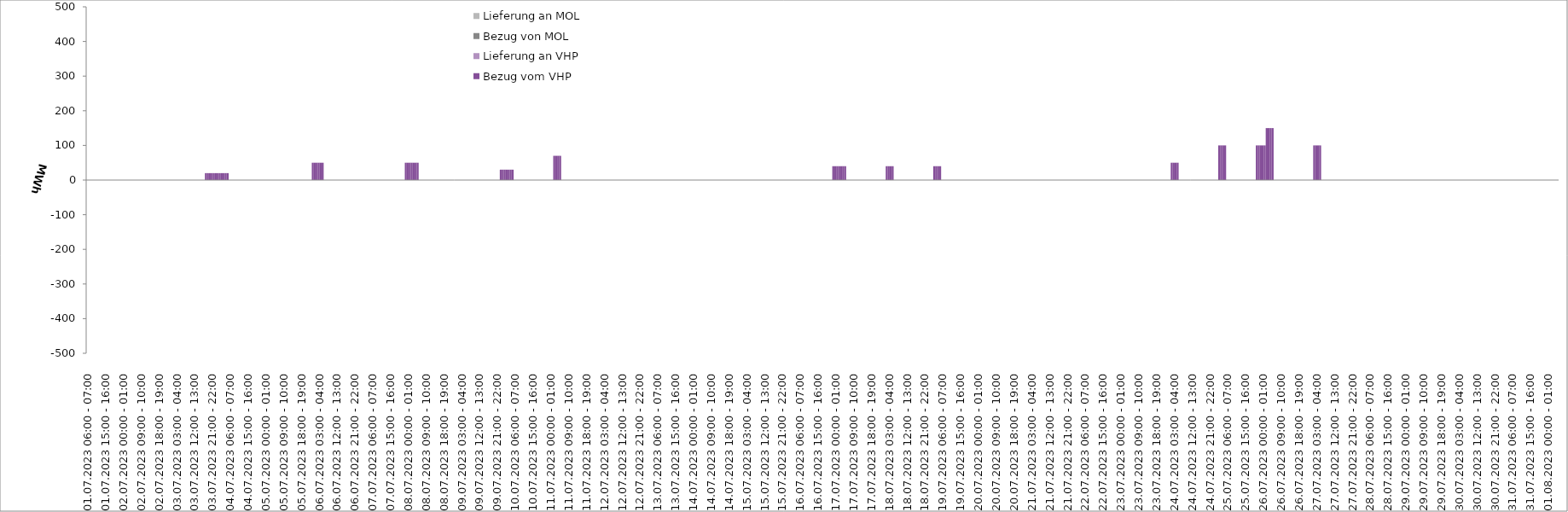
| Category | Bezug vom VHP | Lieferung an VHP | Bezug von MOL | Lieferung an MOL |
|---|---|---|---|---|
| 01.07.2023 06:00 - 07:00 | 0 | 0 | 0 | 0 |
| 01.07.2023 07:00 - 08:00 | 0 | 0 | 0 | 0 |
| 01.07.2023 08:00 - 09:00 | 0 | 0 | 0 | 0 |
| 01.07.2023 09:00 - 10:00 | 0 | 0 | 0 | 0 |
| 01.07.2023 10:00 - 11:00 | 0 | 0 | 0 | 0 |
| 01.07.2023 11:00 - 12:00 | 0 | 0 | 0 | 0 |
| 01.07.2023 12:00 - 13:00 | 0 | 0 | 0 | 0 |
| 01.07.2023 13:00 - 14:00 | 0 | 0 | 0 | 0 |
| 01.07.2023 14:00 - 15:00 | 0 | 0 | 0 | 0 |
| 01.07.2023 15:00 - 16:00 | 0 | 0 | 0 | 0 |
| 01.07.2023 16:00 - 17:00 | 0 | 0 | 0 | 0 |
| 01.07.2023 17:00 - 18:00 | 0 | 0 | 0 | 0 |
| 01.07.2023 18:00 - 19:00 | 0 | 0 | 0 | 0 |
| 01.07.2023 19:00 - 20:00 | 0 | 0 | 0 | 0 |
| 01.07.2023 20:00 - 21:00 | 0 | 0 | 0 | 0 |
| 01.07.2023 21:00 - 22:00 | 0 | 0 | 0 | 0 |
| 01.07.2023 22:00 - 23:00 | 0 | 0 | 0 | 0 |
| 01.07.2023 23:00 - 24:00 | 0 | 0 | 0 | 0 |
| 02.07.2023 00:00 - 01:00 | 0 | 0 | 0 | 0 |
| 02.07.2023 01:00 - 02:00 | 0 | 0 | 0 | 0 |
| 02.07.2023 02:00 - 03:00 | 0 | 0 | 0 | 0 |
| 02.07.2023 03:00 - 04:00 | 0 | 0 | 0 | 0 |
| 02.07.2023 04:00 - 05:00 | 0 | 0 | 0 | 0 |
| 02.07.2023 05:00 - 06:00 | 0 | 0 | 0 | 0 |
| 02.07.2023 06:00 - 07:00 | 0 | 0 | 0 | 0 |
| 02.07.2023 07:00 - 08:00 | 0 | 0 | 0 | 0 |
| 02.07.2023 08:00 - 09:00 | 0 | 0 | 0 | 0 |
| 02.07.2023 09:00 - 10:00 | 0 | 0 | 0 | 0 |
| 02.07.2023 10:00 - 11:00 | 0 | 0 | 0 | 0 |
| 02.07.2023 11:00 - 12:00 | 0 | 0 | 0 | 0 |
| 02.07.2023 12:00 - 13:00 | 0 | 0 | 0 | 0 |
| 02.07.2023 13:00 - 14:00 | 0 | 0 | 0 | 0 |
| 02.07.2023 14:00 - 15:00 | 0 | 0 | 0 | 0 |
| 02.07.2023 15:00 - 16:00 | 0 | 0 | 0 | 0 |
| 02.07.2023 16:00 - 17:00 | 0 | 0 | 0 | 0 |
| 02.07.2023 17:00 - 18:00 | 0 | 0 | 0 | 0 |
| 02.07.2023 18:00 - 19:00 | 0 | 0 | 0 | 0 |
| 02.07.2023 19:00 - 20:00 | 0 | 0 | 0 | 0 |
| 02.07.2023 20:00 - 21:00 | 0 | 0 | 0 | 0 |
| 02.07.2023 21:00 - 22:00 | 0 | 0 | 0 | 0 |
| 02.07.2023 22:00 - 23:00 | 0 | 0 | 0 | 0 |
| 02.07.2023 23:00 - 24:00 | 0 | 0 | 0 | 0 |
| 03.07.2023 00:00 - 01:00 | 0 | 0 | 0 | 0 |
| 03.07.2023 01:00 - 02:00 | 0 | 0 | 0 | 0 |
| 03.07.2023 02:00 - 03:00 | 0 | 0 | 0 | 0 |
| 03.07.2023 03:00 - 04:00 | 0 | 0 | 0 | 0 |
| 03.07.2023 04:00 - 05:00 | 0 | 0 | 0 | 0 |
| 03.07.2023 05:00 - 06:00 | 0 | 0 | 0 | 0 |
| 03.07.2023 06:00 - 07:00 | 0 | 0 | 0 | 0 |
| 03.07.2023 07:00 - 08:00 | 0 | 0 | 0 | 0 |
| 03.07.2023 08:00 - 09:00 | 0 | 0 | 0 | 0 |
| 03.07.2023 09:00 - 10:00 | 0 | 0 | 0 | 0 |
| 03.07.2023 10:00 - 11:00 | 0 | 0 | 0 | 0 |
| 03.07.2023 11:00 - 12:00 | 0 | 0 | 0 | 0 |
| 03.07.2023 12:00 - 13:00 | 0 | 0 | 0 | 0 |
| 03.07.2023 13:00 - 14:00 | 0 | 0 | 0 | 0 |
| 03.07.2023 14:00 - 15:00 | 0 | 0 | 0 | 0 |
| 03.07.2023 15:00 - 16:00 | 0 | 0 | 0 | 0 |
| 03.07.2023 16:00 - 17:00 | 0 | 0 | 0 | 0 |
| 03.07.2023 17:00 - 18:00 | 0 | 0 | 0 | 0 |
| 03.07.2023 18:00 - 19:00 | 20 | 0 | 0 | 0 |
| 03.07.2023 19:00 - 20:00 | 20 | 0 | 0 | 0 |
| 03.07.2023 20:00 - 21:00 | 20 | 0 | 0 | 0 |
| 03.07.2023 21:00 - 22:00 | 20 | 0 | 0 | 0 |
| 03.07.2023 22:00 - 23:00 | 20 | 0 | 0 | 0 |
| 03.07.2023 23:00 - 24:00 | 20 | 0 | 0 | 0 |
| 04.07.2023 00:00 - 01:00 | 20 | 0 | 0 | 0 |
| 04.07.2023 01:00 - 02:00 | 20 | 0 | 0 | 0 |
| 04.07.2023 02:00 - 03:00 | 20 | 0 | 0 | 0 |
| 04.07.2023 03:00 - 04:00 | 20 | 0 | 0 | 0 |
| 04.07.2023 04:00 - 05:00 | 20 | 0 | 0 | 0 |
| 04.07.2023 05:00 - 06:00 | 20 | 0 | 0 | 0 |
| 04.07.2023 06:00 - 07:00 | 0 | 0 | 0 | 0 |
| 04.07.2023 07:00 - 08:00 | 0 | 0 | 0 | 0 |
| 04.07.2023 08:00 - 09:00 | 0 | 0 | 0 | 0 |
| 04.07.2023 09:00 - 10:00 | 0 | 0 | 0 | 0 |
| 04.07.2023 10:00 - 11:00 | 0 | 0 | 0 | 0 |
| 04.07.2023 11:00 - 12:00 | 0 | 0 | 0 | 0 |
| 04.07.2023 12:00 - 13:00 | 0 | 0 | 0 | 0 |
| 04.07.2023 13:00 - 14:00 | 0 | 0 | 0 | 0 |
| 04.07.2023 14:00 - 15:00 | 0 | 0 | 0 | 0 |
| 04.07.2023 15:00 - 16:00 | 0 | 0 | 0 | 0 |
| 04.07.2023 16:00 - 17:00 | 0 | 0 | 0 | 0 |
| 04.07.2023 17:00 - 18:00 | 0 | 0 | 0 | 0 |
| 04.07.2023 18:00 - 19:00 | 0 | 0 | 0 | 0 |
| 04.07.2023 19:00 - 20:00 | 0 | 0 | 0 | 0 |
| 04.07.2023 20:00 - 21:00 | 0 | 0 | 0 | 0 |
| 04.07.2023 21:00 - 22:00 | 0 | 0 | 0 | 0 |
| 04.07.2023 22:00 - 23:00 | 0 | 0 | 0 | 0 |
| 04.07.2023 23:00 - 24:00 | 0 | 0 | 0 | 0 |
| 05.07.2023 00:00 - 01:00 | 0 | 0 | 0 | 0 |
| 05.07.2023 01:00 - 02:00 | 0 | 0 | 0 | 0 |
| 05.07.2023 02:00 - 03:00 | 0 | 0 | 0 | 0 |
| 05.07.2023 03:00 - 04:00 | 0 | 0 | 0 | 0 |
| 05.07.2023 04:00 - 05:00 | 0 | 0 | 0 | 0 |
| 05.07.2023 05:00 - 06:00 | 0 | 0 | 0 | 0 |
| 05.07.2023 06:00 - 07:00 | 0 | 0 | 0 | 0 |
| 05.07.2023 07:00 - 08:00 | 0 | 0 | 0 | 0 |
| 05.07.2023 08:00 - 09:00 | 0 | 0 | 0 | 0 |
| 05.07.2023 09:00 - 10:00 | 0 | 0 | 0 | 0 |
| 05.07.2023 10:00 - 11:00 | 0 | 0 | 0 | 0 |
| 05.07.2023 11:00 - 12:00 | 0 | 0 | 0 | 0 |
| 05.07.2023 12:00 - 13:00 | 0 | 0 | 0 | 0 |
| 05.07.2023 13:00 - 14:00 | 0 | 0 | 0 | 0 |
| 05.07.2023 14:00 - 15:00 | 0 | 0 | 0 | 0 |
| 05.07.2023 15:00 - 16:00 | 0 | 0 | 0 | 0 |
| 05.07.2023 16:00 - 17:00 | 0 | 0 | 0 | 0 |
| 05.07.2023 17:00 - 18:00 | 0 | 0 | 0 | 0 |
| 05.07.2023 18:00 - 19:00 | 0 | 0 | 0 | 0 |
| 05.07.2023 19:00 - 20:00 | 0 | 0 | 0 | 0 |
| 05.07.2023 20:00 - 21:00 | 0 | 0 | 0 | 0 |
| 05.07.2023 21:00 - 22:00 | 0 | 0 | 0 | 0 |
| 05.07.2023 22:00 - 23:00 | 0 | 0 | 0 | 0 |
| 05.07.2023 23:00 - 24:00 | 0 | 0 | 0 | 0 |
| 06.07.2023 00:00 - 01:00 | 50 | 0 | 0 | 0 |
| 06.07.2023 01:00 - 02:00 | 50 | 0 | 0 | 0 |
| 06.07.2023 02:00 - 03:00 | 50 | 0 | 0 | 0 |
| 06.07.2023 03:00 - 04:00 | 50 | 0 | 0 | 0 |
| 06.07.2023 04:00 - 05:00 | 50 | 0 | 0 | 0 |
| 06.07.2023 05:00 - 06:00 | 50 | 0 | 0 | 0 |
| 06.07.2023 06:00 - 07:00 | 0 | 0 | 0 | 0 |
| 06.07.2023 07:00 - 08:00 | 0 | 0 | 0 | 0 |
| 06.07.2023 08:00 - 09:00 | 0 | 0 | 0 | 0 |
| 06.07.2023 09:00 - 10:00 | 0 | 0 | 0 | 0 |
| 06.07.2023 10:00 - 11:00 | 0 | 0 | 0 | 0 |
| 06.07.2023 11:00 - 12:00 | 0 | 0 | 0 | 0 |
| 06.07.2023 12:00 - 13:00 | 0 | 0 | 0 | 0 |
| 06.07.2023 13:00 - 14:00 | 0 | 0 | 0 | 0 |
| 06.07.2023 14:00 - 15:00 | 0 | 0 | 0 | 0 |
| 06.07.2023 15:00 - 16:00 | 0 | 0 | 0 | 0 |
| 06.07.2023 16:00 - 17:00 | 0 | 0 | 0 | 0 |
| 06.07.2023 17:00 - 18:00 | 0 | 0 | 0 | 0 |
| 06.07.2023 18:00 - 19:00 | 0 | 0 | 0 | 0 |
| 06.07.2023 19:00 - 20:00 | 0 | 0 | 0 | 0 |
| 06.07.2023 20:00 - 21:00 | 0 | 0 | 0 | 0 |
| 06.07.2023 21:00 - 22:00 | 0 | 0 | 0 | 0 |
| 06.07.2023 22:00 - 23:00 | 0 | 0 | 0 | 0 |
| 06.07.2023 23:00 - 24:00 | 0 | 0 | 0 | 0 |
| 07.07.2023 00:00 - 01:00 | 0 | 0 | 0 | 0 |
| 07.07.2023 01:00 - 02:00 | 0 | 0 | 0 | 0 |
| 07.07.2023 02:00 - 03:00 | 0 | 0 | 0 | 0 |
| 07.07.2023 03:00 - 04:00 | 0 | 0 | 0 | 0 |
| 07.07.2023 04:00 - 05:00 | 0 | 0 | 0 | 0 |
| 07.07.2023 05:00 - 06:00 | 0 | 0 | 0 | 0 |
| 07.07.2023 06:00 - 07:00 | 0 | 0 | 0 | 0 |
| 07.07.2023 07:00 - 08:00 | 0 | 0 | 0 | 0 |
| 07.07.2023 08:00 - 09:00 | 0 | 0 | 0 | 0 |
| 07.07.2023 09:00 - 10:00 | 0 | 0 | 0 | 0 |
| 07.07.2023 10:00 - 11:00 | 0 | 0 | 0 | 0 |
| 07.07.2023 11:00 - 12:00 | 0 | 0 | 0 | 0 |
| 07.07.2023 12:00 - 13:00 | 0 | 0 | 0 | 0 |
| 07.07.2023 13:00 - 14:00 | 0 | 0 | 0 | 0 |
| 07.07.2023 14:00 - 15:00 | 0 | 0 | 0 | 0 |
| 07.07.2023 15:00 - 16:00 | 0 | 0 | 0 | 0 |
| 07.07.2023 16:00 - 17:00 | 0 | 0 | 0 | 0 |
| 07.07.2023 17:00 - 18:00 | 0 | 0 | 0 | 0 |
| 07.07.2023 18:00 - 19:00 | 0 | 0 | 0 | 0 |
| 07.07.2023 19:00 - 20:00 | 0 | 0 | 0 | 0 |
| 07.07.2023 20:00 - 21:00 | 0 | 0 | 0 | 0 |
| 07.07.2023 21:00 - 22:00 | 0 | 0 | 0 | 0 |
| 07.07.2023 22:00 - 23:00 | 0 | 0 | 0 | 0 |
| 07.07.2023 23:00 - 24:00 | 50 | 0 | 0 | 0 |
| 08.07.2023 00:00 - 01:00 | 50 | 0 | 0 | 0 |
| 08.07.2023 01:00 - 02:00 | 50 | 0 | 0 | 0 |
| 08.07.2023 02:00 - 03:00 | 50 | 0 | 0 | 0 |
| 08.07.2023 03:00 - 04:00 | 50 | 0 | 0 | 0 |
| 08.07.2023 04:00 - 05:00 | 50 | 0 | 0 | 0 |
| 08.07.2023 05:00 - 06:00 | 50 | 0 | 0 | 0 |
| 08.07.2023 06:00 - 07:00 | 0 | 0 | 0 | 0 |
| 08.07.2023 07:00 - 08:00 | 0 | 0 | 0 | 0 |
| 08.07.2023 08:00 - 09:00 | 0 | 0 | 0 | 0 |
| 08.07.2023 09:00 - 10:00 | 0 | 0 | 0 | 0 |
| 08.07.2023 10:00 - 11:00 | 0 | 0 | 0 | 0 |
| 08.07.2023 11:00 - 12:00 | 0 | 0 | 0 | 0 |
| 08.07.2023 12:00 - 13:00 | 0 | 0 | 0 | 0 |
| 08.07.2023 13:00 - 14:00 | 0 | 0 | 0 | 0 |
| 08.07.2023 14:00 - 15:00 | 0 | 0 | 0 | 0 |
| 08.07.2023 15:00 - 16:00 | 0 | 0 | 0 | 0 |
| 08.07.2023 16:00 - 17:00 | 0 | 0 | 0 | 0 |
| 08.07.2023 17:00 - 18:00 | 0 | 0 | 0 | 0 |
| 08.07.2023 18:00 - 19:00 | 0 | 0 | 0 | 0 |
| 08.07.2023 19:00 - 20:00 | 0 | 0 | 0 | 0 |
| 08.07.2023 20:00 - 21:00 | 0 | 0 | 0 | 0 |
| 08.07.2023 21:00 - 22:00 | 0 | 0 | 0 | 0 |
| 08.07.2023 22:00 - 23:00 | 0 | 0 | 0 | 0 |
| 08.07.2023 23:00 - 24:00 | 0 | 0 | 0 | 0 |
| 09.07.2023 00:00 - 01:00 | 0 | 0 | 0 | 0 |
| 09.07.2023 01:00 - 02:00 | 0 | 0 | 0 | 0 |
| 09.07.2023 02:00 - 03:00 | 0 | 0 | 0 | 0 |
| 09.07.2023 03:00 - 04:00 | 0 | 0 | 0 | 0 |
| 09.07.2023 04:00 - 05:00 | 0 | 0 | 0 | 0 |
| 09.07.2023 05:00 - 06:00 | 0 | 0 | 0 | 0 |
| 09.07.2023 06:00 - 07:00 | 0 | 0 | 0 | 0 |
| 09.07.2023 07:00 - 08:00 | 0 | 0 | 0 | 0 |
| 09.07.2023 08:00 - 09:00 | 0 | 0 | 0 | 0 |
| 09.07.2023 09:00 - 10:00 | 0 | 0 | 0 | 0 |
| 09.07.2023 10:00 - 11:00 | 0 | 0 | 0 | 0 |
| 09.07.2023 11:00 - 12:00 | 0 | 0 | 0 | 0 |
| 09.07.2023 12:00 - 13:00 | 0 | 0 | 0 | 0 |
| 09.07.2023 13:00 - 14:00 | 0 | 0 | 0 | 0 |
| 09.07.2023 14:00 - 15:00 | 0 | 0 | 0 | 0 |
| 09.07.2023 15:00 - 16:00 | 0 | 0 | 0 | 0 |
| 09.07.2023 16:00 - 17:00 | 0 | 0 | 0 | 0 |
| 09.07.2023 17:00 - 18:00 | 0 | 0 | 0 | 0 |
| 09.07.2023 18:00 - 19:00 | 0 | 0 | 0 | 0 |
| 09.07.2023 19:00 - 20:00 | 0 | 0 | 0 | 0 |
| 09.07.2023 20:00 - 21:00 | 0 | 0 | 0 | 0 |
| 09.07.2023 21:00 - 22:00 | 0 | 0 | 0 | 0 |
| 09.07.2023 22:00 - 23:00 | 0 | 0 | 0 | 0 |
| 09.07.2023 23:00 - 24:00 | 30 | 0 | 0 | 0 |
| 10.07.2023 00:00 - 01:00 | 30 | 0 | 0 | 0 |
| 10.07.2023 01:00 - 02:00 | 30 | 0 | 0 | 0 |
| 10.07.2023 02:00 - 03:00 | 30 | 0 | 0 | 0 |
| 10.07.2023 03:00 - 04:00 | 30 | 0 | 0 | 0 |
| 10.07.2023 04:00 - 05:00 | 30 | 0 | 0 | 0 |
| 10.07.2023 05:00 - 06:00 | 30 | 0 | 0 | 0 |
| 10.07.2023 06:00 - 07:00 | 0 | 0 | 0 | 0 |
| 10.07.2023 07:00 - 08:00 | 0 | 0 | 0 | 0 |
| 10.07.2023 08:00 - 09:00 | 0 | 0 | 0 | 0 |
| 10.07.2023 09:00 - 10:00 | 0 | 0 | 0 | 0 |
| 10.07.2023 10:00 - 11:00 | 0 | 0 | 0 | 0 |
| 10.07.2023 11:00 - 12:00 | 0 | 0 | 0 | 0 |
| 10.07.2023 12:00 - 13:00 | 0 | 0 | 0 | 0 |
| 10.07.2023 13:00 - 14:00 | 0 | 0 | 0 | 0 |
| 10.07.2023 14:00 - 15:00 | 0 | 0 | 0 | 0 |
| 10.07.2023 15:00 - 16:00 | 0 | 0 | 0 | 0 |
| 10.07.2023 16:00 - 17:00 | 0 | 0 | 0 | 0 |
| 10.07.2023 17:00 - 18:00 | 0 | 0 | 0 | 0 |
| 10.07.2023 18:00 - 19:00 | 0 | 0 | 0 | 0 |
| 10.07.2023 19:00 - 20:00 | 0 | 0 | 0 | 0 |
| 10.07.2023 20:00 - 21:00 | 0 | 0 | 0 | 0 |
| 10.07.2023 21:00 - 22:00 | 0 | 0 | 0 | 0 |
| 10.07.2023 22:00 - 23:00 | 0 | 0 | 0 | 0 |
| 10.07.2023 23:00 - 24:00 | 0 | 0 | 0 | 0 |
| 11.07.2023 00:00 - 01:00 | 0 | 0 | 0 | 0 |
| 11.07.2023 01:00 - 02:00 | 0 | 0 | 0 | 0 |
| 11.07.2023 02:00 - 03:00 | 70 | 0 | 0 | 0 |
| 11.07.2023 03:00 - 04:00 | 70 | 0 | 0 | 0 |
| 11.07.2023 04:00 - 05:00 | 70 | 0 | 0 | 0 |
| 11.07.2023 05:00 - 06:00 | 70 | 0 | 0 | 0 |
| 11.07.2023 06:00 - 07:00 | 0 | 0 | 0 | 0 |
| 11.07.2023 07:00 - 08:00 | 0 | 0 | 0 | 0 |
| 11.07.2023 08:00 - 09:00 | 0 | 0 | 0 | 0 |
| 11.07.2023 09:00 - 10:00 | 0 | 0 | 0 | 0 |
| 11.07.2023 10:00 - 11:00 | 0 | 0 | 0 | 0 |
| 11.07.2023 11:00 - 12:00 | 0 | 0 | 0 | 0 |
| 11.07.2023 12:00 - 13:00 | 0 | 0 | 0 | 0 |
| 11.07.2023 13:00 - 14:00 | 0 | 0 | 0 | 0 |
| 11.07.2023 14:00 - 15:00 | 0 | 0 | 0 | 0 |
| 11.07.2023 15:00 - 16:00 | 0 | 0 | 0 | 0 |
| 11.07.2023 16:00 - 17:00 | 0 | 0 | 0 | 0 |
| 11.07.2023 17:00 - 18:00 | 0 | 0 | 0 | 0 |
| 11.07.2023 18:00 - 19:00 | 0 | 0 | 0 | 0 |
| 11.07.2023 19:00 - 20:00 | 0 | 0 | 0 | 0 |
| 11.07.2023 20:00 - 21:00 | 0 | 0 | 0 | 0 |
| 11.07.2023 21:00 - 22:00 | 0 | 0 | 0 | 0 |
| 11.07.2023 22:00 - 23:00 | 0 | 0 | 0 | 0 |
| 11.07.2023 23:00 - 24:00 | 0 | 0 | 0 | 0 |
| 12.07.2023 00:00 - 01:00 | 0 | 0 | 0 | 0 |
| 12.07.2023 01:00 - 02:00 | 0 | 0 | 0 | 0 |
| 12.07.2023 02:00 - 03:00 | 0 | 0 | 0 | 0 |
| 12.07.2023 03:00 - 04:00 | 0 | 0 | 0 | 0 |
| 12.07.2023 04:00 - 05:00 | 0 | 0 | 0 | 0 |
| 12.07.2023 05:00 - 06:00 | 0 | 0 | 0 | 0 |
| 12.07.2023 06:00 - 07:00 | 0 | 0 | 0 | 0 |
| 12.07.2023 07:00 - 08:00 | 0 | 0 | 0 | 0 |
| 12.07.2023 08:00 - 09:00 | 0 | 0 | 0 | 0 |
| 12.07.2023 09:00 - 10:00 | 0 | 0 | 0 | 0 |
| 12.07.2023 10:00 - 11:00 | 0 | 0 | 0 | 0 |
| 12.07.2023 11:00 - 12:00 | 0 | 0 | 0 | 0 |
| 12.07.2023 12:00 - 13:00 | 0 | 0 | 0 | 0 |
| 12.07.2023 13:00 - 14:00 | 0 | 0 | 0 | 0 |
| 12.07.2023 14:00 - 15:00 | 0 | 0 | 0 | 0 |
| 12.07.2023 15:00 - 16:00 | 0 | 0 | 0 | 0 |
| 12.07.2023 16:00 - 17:00 | 0 | 0 | 0 | 0 |
| 12.07.2023 17:00 - 18:00 | 0 | 0 | 0 | 0 |
| 12.07.2023 18:00 - 19:00 | 0 | 0 | 0 | 0 |
| 12.07.2023 19:00 - 20:00 | 0 | 0 | 0 | 0 |
| 12.07.2023 20:00 - 21:00 | 0 | 0 | 0 | 0 |
| 12.07.2023 21:00 - 22:00 | 0 | 0 | 0 | 0 |
| 12.07.2023 22:00 - 23:00 | 0 | 0 | 0 | 0 |
| 12.07.2023 23:00 - 24:00 | 0 | 0 | 0 | 0 |
| 13.07.2023 00:00 - 01:00 | 0 | 0 | 0 | 0 |
| 13.07.2023 01:00 - 02:00 | 0 | 0 | 0 | 0 |
| 13.07.2023 02:00 - 03:00 | 0 | 0 | 0 | 0 |
| 13.07.2023 03:00 - 04:00 | 0 | 0 | 0 | 0 |
| 13.07.2023 04:00 - 05:00 | 0 | 0 | 0 | 0 |
| 13.07.2023 05:00 - 06:00 | 0 | 0 | 0 | 0 |
| 13.07.2023 06:00 - 07:00 | 0 | 0 | 0 | 0 |
| 13.07.2023 07:00 - 08:00 | 0 | 0 | 0 | 0 |
| 13.07.2023 08:00 - 09:00 | 0 | 0 | 0 | 0 |
| 13.07.2023 09:00 - 10:00 | 0 | 0 | 0 | 0 |
| 13.07.2023 10:00 - 11:00 | 0 | 0 | 0 | 0 |
| 13.07.2023 11:00 - 12:00 | 0 | 0 | 0 | 0 |
| 13.07.2023 12:00 - 13:00 | 0 | 0 | 0 | 0 |
| 13.07.2023 13:00 - 14:00 | 0 | 0 | 0 | 0 |
| 13.07.2023 14:00 - 15:00 | 0 | 0 | 0 | 0 |
| 13.07.2023 15:00 - 16:00 | 0 | 0 | 0 | 0 |
| 13.07.2023 16:00 - 17:00 | 0 | 0 | 0 | 0 |
| 13.07.2023 17:00 - 18:00 | 0 | 0 | 0 | 0 |
| 13.07.2023 18:00 - 19:00 | 0 | 0 | 0 | 0 |
| 13.07.2023 19:00 - 20:00 | 0 | 0 | 0 | 0 |
| 13.07.2023 20:00 - 21:00 | 0 | 0 | 0 | 0 |
| 13.07.2023 21:00 - 22:00 | 0 | 0 | 0 | 0 |
| 13.07.2023 22:00 - 23:00 | 0 | 0 | 0 | 0 |
| 13.07.2023 23:00 - 24:00 | 0 | 0 | 0 | 0 |
| 14.07.2023 00:00 - 01:00 | 0 | 0 | 0 | 0 |
| 14.07.2023 01:00 - 02:00 | 0 | 0 | 0 | 0 |
| 14.07.2023 02:00 - 03:00 | 0 | 0 | 0 | 0 |
| 14.07.2023 03:00 - 04:00 | 0 | 0 | 0 | 0 |
| 14.07.2023 04:00 - 05:00 | 0 | 0 | 0 | 0 |
| 14.07.2023 05:00 - 06:00 | 0 | 0 | 0 | 0 |
| 14.07.2023 06:00 - 07:00 | 0 | 0 | 0 | 0 |
| 14.07.2023 07:00 - 08:00 | 0 | 0 | 0 | 0 |
| 14.07.2023 08:00 - 09:00 | 0 | 0 | 0 | 0 |
| 14.07.2023 09:00 - 10:00 | 0 | 0 | 0 | 0 |
| 14.07.2023 10:00 - 11:00 | 0 | 0 | 0 | 0 |
| 14.07.2023 11:00 - 12:00 | 0 | 0 | 0 | 0 |
| 14.07.2023 12:00 - 13:00 | 0 | 0 | 0 | 0 |
| 14.07.2023 13:00 - 14:00 | 0 | 0 | 0 | 0 |
| 14.07.2023 14:00 - 15:00 | 0 | 0 | 0 | 0 |
| 14.07.2023 15:00 - 16:00 | 0 | 0 | 0 | 0 |
| 14.07.2023 16:00 - 17:00 | 0 | 0 | 0 | 0 |
| 14.07.2023 17:00 - 18:00 | 0 | 0 | 0 | 0 |
| 14.07.2023 18:00 - 19:00 | 0 | 0 | 0 | 0 |
| 14.07.2023 19:00 - 20:00 | 0 | 0 | 0 | 0 |
| 14.07.2023 20:00 - 21:00 | 0 | 0 | 0 | 0 |
| 14.07.2023 21:00 - 22:00 | 0 | 0 | 0 | 0 |
| 14.07.2023 22:00 - 23:00 | 0 | 0 | 0 | 0 |
| 14.07.2023 23:00 - 24:00 | 0 | 0 | 0 | 0 |
| 15.07.2023 00:00 - 01:00 | 0 | 0 | 0 | 0 |
| 15.07.2023 01:00 - 02:00 | 0 | 0 | 0 | 0 |
| 15.07.2023 02:00 - 03:00 | 0 | 0 | 0 | 0 |
| 15.07.2023 03:00 - 04:00 | 0 | 0 | 0 | 0 |
| 15.07.2023 04:00 - 05:00 | 0 | 0 | 0 | 0 |
| 15.07.2023 05:00 - 06:00 | 0 | 0 | 0 | 0 |
| 15.07.2023 06:00 - 07:00 | 0 | 0 | 0 | 0 |
| 15.07.2023 07:00 - 08:00 | 0 | 0 | 0 | 0 |
| 15.07.2023 08:00 - 09:00 | 0 | 0 | 0 | 0 |
| 15.07.2023 09:00 - 10:00 | 0 | 0 | 0 | 0 |
| 15.07.2023 10:00 - 11:00 | 0 | 0 | 0 | 0 |
| 15.07.2023 11:00 - 12:00 | 0 | 0 | 0 | 0 |
| 15.07.2023 12:00 - 13:00 | 0 | 0 | 0 | 0 |
| 15.07.2023 13:00 - 14:00 | 0 | 0 | 0 | 0 |
| 15.07.2023 14:00 - 15:00 | 0 | 0 | 0 | 0 |
| 15.07.2023 15:00 - 16:00 | 0 | 0 | 0 | 0 |
| 15.07.2023 16:00 - 17:00 | 0 | 0 | 0 | 0 |
| 15.07.2023 17:00 - 18:00 | 0 | 0 | 0 | 0 |
| 15.07.2023 18:00 - 19:00 | 0 | 0 | 0 | 0 |
| 15.07.2023 19:00 - 20:00 | 0 | 0 | 0 | 0 |
| 15.07.2023 20:00 - 21:00 | 0 | 0 | 0 | 0 |
| 15.07.2023 21:00 - 22:00 | 0 | 0 | 0 | 0 |
| 15.07.2023 22:00 - 23:00 | 0 | 0 | 0 | 0 |
| 15.07.2023 23:00 - 24:00 | 0 | 0 | 0 | 0 |
| 16.07.2023 00:00 - 01:00 | 0 | 0 | 0 | 0 |
| 16.07.2023 01:00 - 02:00 | 0 | 0 | 0 | 0 |
| 16.07.2023 02:00 - 03:00 | 0 | 0 | 0 | 0 |
| 16.07.2023 03:00 - 04:00 | 0 | 0 | 0 | 0 |
| 16.07.2023 04:00 - 05:00 | 0 | 0 | 0 | 0 |
| 16.07.2023 05:00 - 06:00 | 0 | 0 | 0 | 0 |
| 16.07.2023 06:00 - 07:00 | 0 | 0 | 0 | 0 |
| 16.07.2023 07:00 - 08:00 | 0 | 0 | 0 | 0 |
| 16.07.2023 08:00 - 09:00 | 0 | 0 | 0 | 0 |
| 16.07.2023 09:00 - 10:00 | 0 | 0 | 0 | 0 |
| 16.07.2023 10:00 - 11:00 | 0 | 0 | 0 | 0 |
| 16.07.2023 11:00 - 12:00 | 0 | 0 | 0 | 0 |
| 16.07.2023 12:00 - 13:00 | 0 | 0 | 0 | 0 |
| 16.07.2023 13:00 - 14:00 | 0 | 0 | 0 | 0 |
| 16.07.2023 14:00 - 15:00 | 0 | 0 | 0 | 0 |
| 16.07.2023 15:00 - 16:00 | 0 | 0 | 0 | 0 |
| 16.07.2023 16:00 - 17:00 | 0 | 0 | 0 | 0 |
| 16.07.2023 17:00 - 18:00 | 0 | 0 | 0 | 0 |
| 16.07.2023 18:00 - 19:00 | 0 | 0 | 0 | 0 |
| 16.07.2023 19:00 - 20:00 | 0 | 0 | 0 | 0 |
| 16.07.2023 20:00 - 21:00 | 0 | 0 | 0 | 0 |
| 16.07.2023 21:00 - 22:00 | 0 | 0 | 0 | 0 |
| 16.07.2023 22:00 - 23:00 | 0 | 0 | 0 | 0 |
| 16.07.2023 23:00 - 24:00 | 40 | 0 | 0 | 0 |
| 17.07.2023 00:00 - 01:00 | 40 | 0 | 0 | 0 |
| 17.07.2023 01:00 - 02:00 | 40 | 0 | 0 | 0 |
| 17.07.2023 02:00 - 03:00 | 40 | 0 | 0 | 0 |
| 17.07.2023 03:00 - 04:00 | 40 | 0 | 0 | 0 |
| 17.07.2023 04:00 - 05:00 | 40 | 0 | 0 | 0 |
| 17.07.2023 05:00 - 06:00 | 40 | 0 | 0 | 0 |
| 17.07.2023 06:00 - 07:00 | 0 | 0 | 0 | 0 |
| 17.07.2023 07:00 - 08:00 | 0 | 0 | 0 | 0 |
| 17.07.2023 08:00 - 09:00 | 0 | 0 | 0 | 0 |
| 17.07.2023 09:00 - 10:00 | 0 | 0 | 0 | 0 |
| 17.07.2023 10:00 - 11:00 | 0 | 0 | 0 | 0 |
| 17.07.2023 11:00 - 12:00 | 0 | 0 | 0 | 0 |
| 17.07.2023 12:00 - 13:00 | 0 | 0 | 0 | 0 |
| 17.07.2023 13:00 - 14:00 | 0 | 0 | 0 | 0 |
| 17.07.2023 14:00 - 15:00 | 0 | 0 | 0 | 0 |
| 17.07.2023 15:00 - 16:00 | 0 | 0 | 0 | 0 |
| 17.07.2023 16:00 - 17:00 | 0 | 0 | 0 | 0 |
| 17.07.2023 17:00 - 18:00 | 0 | 0 | 0 | 0 |
| 17.07.2023 18:00 - 19:00 | 0 | 0 | 0 | 0 |
| 17.07.2023 19:00 - 20:00 | 0 | 0 | 0 | 0 |
| 17.07.2023 20:00 - 21:00 | 0 | 0 | 0 | 0 |
| 17.07.2023 21:00 - 22:00 | 0 | 0 | 0 | 0 |
| 17.07.2023 22:00 - 23:00 | 0 | 0 | 0 | 0 |
| 17.07.2023 23:00 - 24:00 | 0 | 0 | 0 | 0 |
| 18.07.2023 00:00 - 01:00 | 0 | 0 | 0 | 0 |
| 18.07.2023 01:00 - 02:00 | 0 | 0 | 0 | 0 |
| 18.07.2023 02:00 - 03:00 | 40 | 0 | 0 | 0 |
| 18.07.2023 03:00 - 04:00 | 40 | 0 | 0 | 0 |
| 18.07.2023 04:00 - 05:00 | 40 | 0 | 0 | 0 |
| 18.07.2023 05:00 - 06:00 | 40 | 0 | 0 | 0 |
| 18.07.2023 06:00 - 07:00 | 0 | 0 | 0 | 0 |
| 18.07.2023 07:00 - 08:00 | 0 | 0 | 0 | 0 |
| 18.07.2023 08:00 - 09:00 | 0 | 0 | 0 | 0 |
| 18.07.2023 09:00 - 10:00 | 0 | 0 | 0 | 0 |
| 18.07.2023 10:00 - 11:00 | 0 | 0 | 0 | 0 |
| 18.07.2023 11:00 - 12:00 | 0 | 0 | 0 | 0 |
| 18.07.2023 12:00 - 13:00 | 0 | 0 | 0 | 0 |
| 18.07.2023 13:00 - 14:00 | 0 | 0 | 0 | 0 |
| 18.07.2023 14:00 - 15:00 | 0 | 0 | 0 | 0 |
| 18.07.2023 15:00 - 16:00 | 0 | 0 | 0 | 0 |
| 18.07.2023 16:00 - 17:00 | 0 | 0 | 0 | 0 |
| 18.07.2023 17:00 - 18:00 | 0 | 0 | 0 | 0 |
| 18.07.2023 18:00 - 19:00 | 0 | 0 | 0 | 0 |
| 18.07.2023 19:00 - 20:00 | 0 | 0 | 0 | 0 |
| 18.07.2023 20:00 - 21:00 | 0 | 0 | 0 | 0 |
| 18.07.2023 21:00 - 22:00 | 0 | 0 | 0 | 0 |
| 18.07.2023 22:00 - 23:00 | 0 | 0 | 0 | 0 |
| 18.07.2023 23:00 - 24:00 | 0 | 0 | 0 | 0 |
| 19.07.2023 00:00 - 01:00 | 0 | 0 | 0 | 0 |
| 19.07.2023 01:00 - 02:00 | 0 | 0 | 0 | 0 |
| 19.07.2023 02:00 - 03:00 | 40 | 0 | 0 | 0 |
| 19.07.2023 03:00 - 04:00 | 40 | 0 | 0 | 0 |
| 19.07.2023 04:00 - 05:00 | 40 | 0 | 0 | 0 |
| 19.07.2023 05:00 - 06:00 | 40 | 0 | 0 | 0 |
| 19.07.2023 06:00 - 07:00 | 0 | 0 | 0 | 0 |
| 19.07.2023 07:00 - 08:00 | 0 | 0 | 0 | 0 |
| 19.07.2023 08:00 - 09:00 | 0 | 0 | 0 | 0 |
| 19.07.2023 09:00 - 10:00 | 0 | 0 | 0 | 0 |
| 19.07.2023 10:00 - 11:00 | 0 | 0 | 0 | 0 |
| 19.07.2023 11:00 - 12:00 | 0 | 0 | 0 | 0 |
| 19.07.2023 12:00 - 13:00 | 0 | 0 | 0 | 0 |
| 19.07.2023 13:00 - 14:00 | 0 | 0 | 0 | 0 |
| 19.07.2023 14:00 - 15:00 | 0 | 0 | 0 | 0 |
| 19.07.2023 15:00 - 16:00 | 0 | 0 | 0 | 0 |
| 19.07.2023 16:00 - 17:00 | 0 | 0 | 0 | 0 |
| 19.07.2023 17:00 - 18:00 | 0 | 0 | 0 | 0 |
| 19.07.2023 18:00 - 19:00 | 0 | 0 | 0 | 0 |
| 19.07.2023 19:00 - 20:00 | 0 | 0 | 0 | 0 |
| 19.07.2023 20:00 - 21:00 | 0 | 0 | 0 | 0 |
| 19.07.2023 21:00 - 22:00 | 0 | 0 | 0 | 0 |
| 19.07.2023 22:00 - 23:00 | 0 | 0 | 0 | 0 |
| 19.07.2023 23:00 - 24:00 | 0 | 0 | 0 | 0 |
| 20.07.2023 00:00 - 01:00 | 0 | 0 | 0 | 0 |
| 20.07.2023 01:00 - 02:00 | 0 | 0 | 0 | 0 |
| 20.07.2023 02:00 - 03:00 | 0 | 0 | 0 | 0 |
| 20.07.2023 03:00 - 04:00 | 0 | 0 | 0 | 0 |
| 20.07.2023 04:00 - 05:00 | 0 | 0 | 0 | 0 |
| 20.07.2023 05:00 - 06:00 | 0 | 0 | 0 | 0 |
| 20.07.2023 06:00 - 07:00 | 0 | 0 | 0 | 0 |
| 20.07.2023 07:00 - 08:00 | 0 | 0 | 0 | 0 |
| 20.07.2023 08:00 - 09:00 | 0 | 0 | 0 | 0 |
| 20.07.2023 09:00 - 10:00 | 0 | 0 | 0 | 0 |
| 20.07.2023 10:00 - 11:00 | 0 | 0 | 0 | 0 |
| 20.07.2023 11:00 - 12:00 | 0 | 0 | 0 | 0 |
| 20.07.2023 12:00 - 13:00 | 0 | 0 | 0 | 0 |
| 20.07.2023 13:00 - 14:00 | 0 | 0 | 0 | 0 |
| 20.07.2023 14:00 - 15:00 | 0 | 0 | 0 | 0 |
| 20.07.2023 15:00 - 16:00 | 0 | 0 | 0 | 0 |
| 20.07.2023 16:00 - 17:00 | 0 | 0 | 0 | 0 |
| 20.07.2023 17:00 - 18:00 | 0 | 0 | 0 | 0 |
| 20.07.2023 18:00 - 19:00 | 0 | 0 | 0 | 0 |
| 20.07.2023 19:00 - 20:00 | 0 | 0 | 0 | 0 |
| 20.07.2023 20:00 - 21:00 | 0 | 0 | 0 | 0 |
| 20.07.2023 21:00 - 22:00 | 0 | 0 | 0 | 0 |
| 20.07.2023 22:00 - 23:00 | 0 | 0 | 0 | 0 |
| 20.07.2023 23:00 - 24:00 | 0 | 0 | 0 | 0 |
| 21.07.2023 00:00 - 01:00 | 0 | 0 | 0 | 0 |
| 21.07.2023 01:00 - 02:00 | 0 | 0 | 0 | 0 |
| 21.07.2023 02:00 - 03:00 | 0 | 0 | 0 | 0 |
| 21.07.2023 03:00 - 04:00 | 0 | 0 | 0 | 0 |
| 21.07.2023 04:00 - 05:00 | 0 | 0 | 0 | 0 |
| 21.07.2023 05:00 - 06:00 | 0 | 0 | 0 | 0 |
| 21.07.2023 06:00 - 07:00 | 0 | 0 | 0 | 0 |
| 21.07.2023 07:00 - 08:00 | 0 | 0 | 0 | 0 |
| 21.07.2023 08:00 - 09:00 | 0 | 0 | 0 | 0 |
| 21.07.2023 09:00 - 10:00 | 0 | 0 | 0 | 0 |
| 21.07.2023 10:00 - 11:00 | 0 | 0 | 0 | 0 |
| 21.07.2023 11:00 - 12:00 | 0 | 0 | 0 | 0 |
| 21.07.2023 12:00 - 13:00 | 0 | 0 | 0 | 0 |
| 21.07.2023 13:00 - 14:00 | 0 | 0 | 0 | 0 |
| 21.07.2023 14:00 - 15:00 | 0 | 0 | 0 | 0 |
| 21.07.2023 15:00 - 16:00 | 0 | 0 | 0 | 0 |
| 21.07.2023 16:00 - 17:00 | 0 | 0 | 0 | 0 |
| 21.07.2023 17:00 - 18:00 | 0 | 0 | 0 | 0 |
| 21.07.2023 18:00 - 19:00 | 0 | 0 | 0 | 0 |
| 21.07.2023 19:00 - 20:00 | 0 | 0 | 0 | 0 |
| 21.07.2023 20:00 - 21:00 | 0 | 0 | 0 | 0 |
| 21.07.2023 21:00 - 22:00 | 0 | 0 | 0 | 0 |
| 21.07.2023 22:00 - 23:00 | 0 | 0 | 0 | 0 |
| 21.07.2023 23:00 - 24:00 | 0 | 0 | 0 | 0 |
| 22.07.2023 00:00 - 01:00 | 0 | 0 | 0 | 0 |
| 22.07.2023 01:00 - 02:00 | 0 | 0 | 0 | 0 |
| 22.07.2023 02:00 - 03:00 | 0 | 0 | 0 | 0 |
| 22.07.2023 03:00 - 04:00 | 0 | 0 | 0 | 0 |
| 22.07.2023 04:00 - 05:00 | 0 | 0 | 0 | 0 |
| 22.07.2023 05:00 - 06:00 | 0 | 0 | 0 | 0 |
| 22.07.2023 06:00 - 07:00 | 0 | 0 | 0 | 0 |
| 22.07.2023 07:00 - 08:00 | 0 | 0 | 0 | 0 |
| 22.07.2023 08:00 - 09:00 | 0 | 0 | 0 | 0 |
| 22.07.2023 09:00 - 10:00 | 0 | 0 | 0 | 0 |
| 22.07.2023 10:00 - 11:00 | 0 | 0 | 0 | 0 |
| 22.07.2023 11:00 - 12:00 | 0 | 0 | 0 | 0 |
| 22.07.2023 12:00 - 13:00 | 0 | 0 | 0 | 0 |
| 22.07.2023 13:00 - 14:00 | 0 | 0 | 0 | 0 |
| 22.07.2023 14:00 - 15:00 | 0 | 0 | 0 | 0 |
| 22.07.2023 15:00 - 16:00 | 0 | 0 | 0 | 0 |
| 22.07.2023 16:00 - 17:00 | 0 | 0 | 0 | 0 |
| 22.07.2023 17:00 - 18:00 | 0 | 0 | 0 | 0 |
| 22.07.2023 18:00 - 19:00 | 0 | 0 | 0 | 0 |
| 22.07.2023 19:00 - 20:00 | 0 | 0 | 0 | 0 |
| 22.07.2023 20:00 - 21:00 | 0 | 0 | 0 | 0 |
| 22.07.2023 21:00 - 22:00 | 0 | 0 | 0 | 0 |
| 22.07.2023 22:00 - 23:00 | 0 | 0 | 0 | 0 |
| 22.07.2023 23:00 - 24:00 | 0 | 0 | 0 | 0 |
| 23.07.2023 00:00 - 01:00 | 0 | 0 | 0 | 0 |
| 23.07.2023 01:00 - 02:00 | 0 | 0 | 0 | 0 |
| 23.07.2023 02:00 - 03:00 | 0 | 0 | 0 | 0 |
| 23.07.2023 03:00 - 04:00 | 0 | 0 | 0 | 0 |
| 23.07.2023 04:00 - 05:00 | 0 | 0 | 0 | 0 |
| 23.07.2023 05:00 - 06:00 | 0 | 0 | 0 | 0 |
| 23.07.2023 06:00 - 07:00 | 0 | 0 | 0 | 0 |
| 23.07.2023 07:00 - 08:00 | 0 | 0 | 0 | 0 |
| 23.07.2023 08:00 - 09:00 | 0 | 0 | 0 | 0 |
| 23.07.2023 09:00 - 10:00 | 0 | 0 | 0 | 0 |
| 23.07.2023 10:00 - 11:00 | 0 | 0 | 0 | 0 |
| 23.07.2023 11:00 - 12:00 | 0 | 0 | 0 | 0 |
| 23.07.2023 12:00 - 13:00 | 0 | 0 | 0 | 0 |
| 23.07.2023 13:00 - 14:00 | 0 | 0 | 0 | 0 |
| 23.07.2023 14:00 - 15:00 | 0 | 0 | 0 | 0 |
| 23.07.2023 15:00 - 16:00 | 0 | 0 | 0 | 0 |
| 23.07.2023 16:00 - 17:00 | 0 | 0 | 0 | 0 |
| 23.07.2023 17:00 - 18:00 | 0 | 0 | 0 | 0 |
| 23.07.2023 18:00 - 19:00 | 0 | 0 | 0 | 0 |
| 23.07.2023 19:00 - 20:00 | 0 | 0 | 0 | 0 |
| 23.07.2023 20:00 - 21:00 | 0 | 0 | 0 | 0 |
| 23.07.2023 21:00 - 22:00 | 0 | 0 | 0 | 0 |
| 23.07.2023 22:00 - 23:00 | 0 | 0 | 0 | 0 |
| 23.07.2023 23:00 - 24:00 | 0 | 0 | 0 | 0 |
| 24.07.2023 00:00 - 01:00 | 0 | 0 | 0 | 0 |
| 24.07.2023 01:00 - 02:00 | 0 | 0 | 0 | 0 |
| 24.07.2023 02:00 - 03:00 | 50 | 0 | 0 | 0 |
| 24.07.2023 03:00 - 04:00 | 50 | 0 | 0 | 0 |
| 24.07.2023 04:00 - 05:00 | 50 | 0 | 0 | 0 |
| 24.07.2023 05:00 - 06:00 | 50 | 0 | 0 | 0 |
| 24.07.2023 06:00 - 07:00 | 0 | 0 | 0 | 0 |
| 24.07.2023 07:00 - 08:00 | 0 | 0 | 0 | 0 |
| 24.07.2023 08:00 - 09:00 | 0 | 0 | 0 | 0 |
| 24.07.2023 09:00 - 10:00 | 0 | 0 | 0 | 0 |
| 24.07.2023 10:00 - 11:00 | 0 | 0 | 0 | 0 |
| 24.07.2023 11:00 - 12:00 | 0 | 0 | 0 | 0 |
| 24.07.2023 12:00 - 13:00 | 0 | 0 | 0 | 0 |
| 24.07.2023 13:00 - 14:00 | 0 | 0 | 0 | 0 |
| 24.07.2023 14:00 - 15:00 | 0 | 0 | 0 | 0 |
| 24.07.2023 15:00 - 16:00 | 0 | 0 | 0 | 0 |
| 24.07.2023 16:00 - 17:00 | 0 | 0 | 0 | 0 |
| 24.07.2023 17:00 - 18:00 | 0 | 0 | 0 | 0 |
| 24.07.2023 18:00 - 19:00 | 0 | 0 | 0 | 0 |
| 24.07.2023 19:00 - 20:00 | 0 | 0 | 0 | 0 |
| 24.07.2023 20:00 - 21:00 | 0 | 0 | 0 | 0 |
| 24.07.2023 21:00 - 22:00 | 0 | 0 | 0 | 0 |
| 24.07.2023 22:00 - 23:00 | 0 | 0 | 0 | 0 |
| 24.07.2023 23:00 - 24:00 | 0 | 0 | 0 | 0 |
| 25.07.2023 00:00 - 01:00 | 0 | 0 | 0 | 0 |
| 25.07.2023 01:00 - 02:00 | 0 | 0 | 0 | 0 |
| 25.07.2023 02:00 - 03:00 | 100 | 0 | 0 | 0 |
| 25.07.2023 03:00 - 04:00 | 100 | 0 | 0 | 0 |
| 25.07.2023 04:00 - 05:00 | 100 | 0 | 0 | 0 |
| 25.07.2023 05:00 - 06:00 | 100 | 0 | 0 | 0 |
| 25.07.2023 06:00 - 07:00 | 0 | 0 | 0 | 0 |
| 25.07.2023 07:00 - 08:00 | 0 | 0 | 0 | 0 |
| 25.07.2023 08:00 - 09:00 | 0 | 0 | 0 | 0 |
| 25.07.2023 09:00 - 10:00 | 0 | 0 | 0 | 0 |
| 25.07.2023 10:00 - 11:00 | 0 | 0 | 0 | 0 |
| 25.07.2023 11:00 - 12:00 | 0 | 0 | 0 | 0 |
| 25.07.2023 12:00 - 13:00 | 0 | 0 | 0 | 0 |
| 25.07.2023 13:00 - 14:00 | 0 | 0 | 0 | 0 |
| 25.07.2023 14:00 - 15:00 | 0 | 0 | 0 | 0 |
| 25.07.2023 15:00 - 16:00 | 0 | 0 | 0 | 0 |
| 25.07.2023 16:00 - 17:00 | 0 | 0 | 0 | 0 |
| 25.07.2023 17:00 - 18:00 | 0 | 0 | 0 | 0 |
| 25.07.2023 18:00 - 19:00 | 0 | 0 | 0 | 0 |
| 25.07.2023 19:00 - 20:00 | 0 | 0 | 0 | 0 |
| 25.07.2023 20:00 - 21:00 | 0 | 0 | 0 | 0 |
| 25.07.2023 21:00 - 22:00 | 100 | 0 | 0 | 0 |
| 25.07.2023 22:00 - 23:00 | 100 | 0 | 0 | 0 |
| 25.07.2023 23:00 - 24:00 | 100 | 0 | 0 | 0 |
| 26.07.2023 00:00 - 01:00 | 100 | 0 | 0 | 0 |
| 26.07.2023 01:00 - 02:00 | 100 | 0 | 0 | 0 |
| 26.07.2023 02:00 - 03:00 | 150 | 0 | 0 | 0 |
| 26.07.2023 03:00 - 04:00 | 150 | 0 | 0 | 0 |
| 26.07.2023 04:00 - 05:00 | 150 | 0 | 0 | 0 |
| 26.07.2023 05:00 - 06:00 | 150 | 0 | 0 | 0 |
| 26.07.2023 06:00 - 07:00 | 0 | 0 | 0 | 0 |
| 26.07.2023 07:00 - 08:00 | 0 | 0 | 0 | 0 |
| 26.07.2023 08:00 - 09:00 | 0 | 0 | 0 | 0 |
| 26.07.2023 09:00 - 10:00 | 0 | 0 | 0 | 0 |
| 26.07.2023 10:00 - 11:00 | 0 | 0 | 0 | 0 |
| 26.07.2023 11:00 - 12:00 | 0 | 0 | 0 | 0 |
| 26.07.2023 12:00 - 13:00 | 0 | 0 | 0 | 0 |
| 26.07.2023 13:00 - 14:00 | 0 | 0 | 0 | 0 |
| 26.07.2023 14:00 - 15:00 | 0 | 0 | 0 | 0 |
| 26.07.2023 15:00 - 16:00 | 0 | 0 | 0 | 0 |
| 26.07.2023 16:00 - 17:00 | 0 | 0 | 0 | 0 |
| 26.07.2023 17:00 - 18:00 | 0 | 0 | 0 | 0 |
| 26.07.2023 18:00 - 19:00 | 0 | 0 | 0 | 0 |
| 26.07.2023 19:00 - 20:00 | 0 | 0 | 0 | 0 |
| 26.07.2023 20:00 - 21:00 | 0 | 0 | 0 | 0 |
| 26.07.2023 21:00 - 22:00 | 0 | 0 | 0 | 0 |
| 26.07.2023 22:00 - 23:00 | 0 | 0 | 0 | 0 |
| 26.07.2023 23:00 - 24:00 | 0 | 0 | 0 | 0 |
| 27.07.2023 00:00 - 01:00 | 0 | 0 | 0 | 0 |
| 27.07.2023 01:00 - 02:00 | 0 | 0 | 0 | 0 |
| 27.07.2023 02:00 - 03:00 | 100 | 0 | 0 | 0 |
| 27.07.2023 03:00 - 04:00 | 100 | 0 | 0 | 0 |
| 27.07.2023 04:00 - 05:00 | 100 | 0 | 0 | 0 |
| 27.07.2023 05:00 - 06:00 | 100 | 0 | 0 | 0 |
| 27.07.2023 06:00 - 07:00 | 0 | 0 | 0 | 0 |
| 27.07.2023 07:00 - 08:00 | 0 | 0 | 0 | 0 |
| 27.07.2023 08:00 - 09:00 | 0 | 0 | 0 | 0 |
| 27.07.2023 09:00 - 10:00 | 0 | 0 | 0 | 0 |
| 27.07.2023 10:00 - 11:00 | 0 | 0 | 0 | 0 |
| 27.07.2023 11:00 - 12:00 | 0 | 0 | 0 | 0 |
| 27.07.2023 12:00 - 13:00 | 0 | 0 | 0 | 0 |
| 27.07.2023 13:00 - 14:00 | 0 | 0 | 0 | 0 |
| 27.07.2023 14:00 - 15:00 | 0 | 0 | 0 | 0 |
| 27.07.2023 15:00 - 16:00 | 0 | 0 | 0 | 0 |
| 27.07.2023 16:00 - 17:00 | 0 | 0 | 0 | 0 |
| 27.07.2023 17:00 - 18:00 | 0 | 0 | 0 | 0 |
| 27.07.2023 18:00 - 19:00 | 0 | 0 | 0 | 0 |
| 27.07.2023 19:00 - 20:00 | 0 | 0 | 0 | 0 |
| 27.07.2023 20:00 - 21:00 | 0 | 0 | 0 | 0 |
| 27.07.2023 21:00 - 22:00 | 0 | 0 | 0 | 0 |
| 27.07.2023 22:00 - 23:00 | 0 | 0 | 0 | 0 |
| 27.07.2023 23:00 - 24:00 | 0 | 0 | 0 | 0 |
| 28.07.2023 00:00 - 01:00 | 0 | 0 | 0 | 0 |
| 28.07.2023 01:00 - 02:00 | 0 | 0 | 0 | 0 |
| 28.07.2023 02:00 - 03:00 | 0 | 0 | 0 | 0 |
| 28.07.2023 03:00 - 04:00 | 0 | 0 | 0 | 0 |
| 28.07.2023 04:00 - 05:00 | 0 | 0 | 0 | 0 |
| 28.07.2023 05:00 - 06:00 | 0 | 0 | 0 | 0 |
| 28.07.2023 06:00 - 07:00 | 0 | 0 | 0 | 0 |
| 28.07.2023 07:00 - 08:00 | 0 | 0 | 0 | 0 |
| 28.07.2023 08:00 - 09:00 | 0 | 0 | 0 | 0 |
| 28.07.2023 09:00 - 10:00 | 0 | 0 | 0 | 0 |
| 28.07.2023 10:00 - 11:00 | 0 | 0 | 0 | 0 |
| 28.07.2023 11:00 - 12:00 | 0 | 0 | 0 | 0 |
| 28.07.2023 12:00 - 13:00 | 0 | 0 | 0 | 0 |
| 28.07.2023 13:00 - 14:00 | 0 | 0 | 0 | 0 |
| 28.07.2023 14:00 - 15:00 | 0 | 0 | 0 | 0 |
| 28.07.2023 15:00 - 16:00 | 0 | 0 | 0 | 0 |
| 28.07.2023 16:00 - 17:00 | 0 | 0 | 0 | 0 |
| 28.07.2023 17:00 - 18:00 | 0 | 0 | 0 | 0 |
| 28.07.2023 18:00 - 19:00 | 0 | 0 | 0 | 0 |
| 28.07.2023 19:00 - 20:00 | 0 | 0 | 0 | 0 |
| 28.07.2023 20:00 - 21:00 | 0 | 0 | 0 | 0 |
| 28.07.2023 21:00 - 22:00 | 0 | 0 | 0 | 0 |
| 28.07.2023 22:00 - 23:00 | 0 | 0 | 0 | 0 |
| 28.07.2023 23:00 - 24:00 | 0 | 0 | 0 | 0 |
| 29.07.2023 00:00 - 01:00 | 0 | 0 | 0 | 0 |
| 29.07.2023 01:00 - 02:00 | 0 | 0 | 0 | 0 |
| 29.07.2023 02:00 - 03:00 | 0 | 0 | 0 | 0 |
| 29.07.2023 03:00 - 04:00 | 0 | 0 | 0 | 0 |
| 29.07.2023 04:00 - 05:00 | 0 | 0 | 0 | 0 |
| 29.07.2023 05:00 - 06:00 | 0 | 0 | 0 | 0 |
| 29.07.2023 06:00 - 07:00 | 0 | 0 | 0 | 0 |
| 29.07.2023 07:00 - 08:00 | 0 | 0 | 0 | 0 |
| 29.07.2023 08:00 - 09:00 | 0 | 0 | 0 | 0 |
| 29.07.2023 09:00 - 10:00 | 0 | 0 | 0 | 0 |
| 29.07.2023 10:00 - 11:00 | 0 | 0 | 0 | 0 |
| 29.07.2023 11:00 - 12:00 | 0 | 0 | 0 | 0 |
| 29.07.2023 12:00 - 13:00 | 0 | 0 | 0 | 0 |
| 29.07.2023 13:00 - 14:00 | 0 | 0 | 0 | 0 |
| 29.07.2023 14:00 - 15:00 | 0 | 0 | 0 | 0 |
| 29.07.2023 15:00 - 16:00 | 0 | 0 | 0 | 0 |
| 29.07.2023 16:00 - 17:00 | 0 | 0 | 0 | 0 |
| 29.07.2023 17:00 - 18:00 | 0 | 0 | 0 | 0 |
| 29.07.2023 18:00 - 19:00 | 0 | 0 | 0 | 0 |
| 29.07.2023 19:00 - 20:00 | 0 | 0 | 0 | 0 |
| 29.07.2023 20:00 - 21:00 | 0 | 0 | 0 | 0 |
| 29.07.2023 21:00 - 22:00 | 0 | 0 | 0 | 0 |
| 29.07.2023 22:00 - 23:00 | 0 | 0 | 0 | 0 |
| 29.07.2023 23:00 - 24:00 | 0 | 0 | 0 | 0 |
| 30.07.2023 00:00 - 01:00 | 0 | 0 | 0 | 0 |
| 30.07.2023 01:00 - 02:00 | 0 | 0 | 0 | 0 |
| 30.07.2023 02:00 - 03:00 | 0 | 0 | 0 | 0 |
| 30.07.2023 03:00 - 04:00 | 0 | 0 | 0 | 0 |
| 30.07.2023 04:00 - 05:00 | 0 | 0 | 0 | 0 |
| 30.07.2023 05:00 - 06:00 | 0 | 0 | 0 | 0 |
| 30.07.2023 06:00 - 07:00 | 0 | 0 | 0 | 0 |
| 30.07.2023 07:00 - 08:00 | 0 | 0 | 0 | 0 |
| 30.07.2023 08:00 - 09:00 | 0 | 0 | 0 | 0 |
| 30.07.2023 09:00 - 10:00 | 0 | 0 | 0 | 0 |
| 30.07.2023 10:00 - 11:00 | 0 | 0 | 0 | 0 |
| 30.07.2023 11:00 - 12:00 | 0 | 0 | 0 | 0 |
| 30.07.2023 12:00 - 13:00 | 0 | 0 | 0 | 0 |
| 30.07.2023 13:00 - 14:00 | 0 | 0 | 0 | 0 |
| 30.07.2023 14:00 - 15:00 | 0 | 0 | 0 | 0 |
| 30.07.2023 15:00 - 16:00 | 0 | 0 | 0 | 0 |
| 30.07.2023 16:00 - 17:00 | 0 | 0 | 0 | 0 |
| 30.07.2023 17:00 - 18:00 | 0 | 0 | 0 | 0 |
| 30.07.2023 18:00 - 19:00 | 0 | 0 | 0 | 0 |
| 30.07.2023 19:00 - 20:00 | 0 | 0 | 0 | 0 |
| 30.07.2023 20:00 - 21:00 | 0 | 0 | 0 | 0 |
| 30.07.2023 21:00 - 22:00 | 0 | 0 | 0 | 0 |
| 30.07.2023 22:00 - 23:00 | 0 | 0 | 0 | 0 |
| 30.07.2023 23:00 - 24:00 | 0 | 0 | 0 | 0 |
| 31.07.2023 00:00 - 01:00 | 0 | 0 | 0 | 0 |
| 31.07.2023 01:00 - 02:00 | 0 | 0 | 0 | 0 |
| 31.07.2023 02:00 - 03:00 | 0 | 0 | 0 | 0 |
| 31.07.2023 03:00 - 04:00 | 0 | 0 | 0 | 0 |
| 31.07.2023 04:00 - 05:00 | 0 | 0 | 0 | 0 |
| 31.07.2023 05:00 - 06:00 | 0 | 0 | 0 | 0 |
| 31.07.2023 06:00 - 07:00 | 0 | 0 | 0 | 0 |
| 31.07.2023 07:00 - 08:00 | 0 | 0 | 0 | 0 |
| 31.07.2023 08:00 - 09:00 | 0 | 0 | 0 | 0 |
| 31.07.2023 09:00 - 10:00 | 0 | 0 | 0 | 0 |
| 31.07.2023 10:00 - 11:00 | 0 | 0 | 0 | 0 |
| 31.07.2023 11:00 - 12:00 | 0 | 0 | 0 | 0 |
| 31.07.2023 12:00 - 13:00 | 0 | 0 | 0 | 0 |
| 31.07.2023 13:00 - 14:00 | 0 | 0 | 0 | 0 |
| 31.07.2023 14:00 - 15:00 | 0 | 0 | 0 | 0 |
| 31.07.2023 15:00 - 16:00 | 0 | 0 | 0 | 0 |
| 31.07.2023 16:00 - 17:00 | 0 | 0 | 0 | 0 |
| 31.07.2023 17:00 - 18:00 | 0 | 0 | 0 | 0 |
| 31.07.2023 18:00 - 19:00 | 0 | 0 | 0 | 0 |
| 31.07.2023 19:00 - 20:00 | 0 | 0 | 0 | 0 |
| 31.07.2023 20:00 - 21:00 | 0 | 0 | 0 | 0 |
| 31.07.2023 21:00 - 22:00 | 0 | 0 | 0 | 0 |
| 31.07.2023 22:00 - 23:00 | 0 | 0 | 0 | 0 |
| 31.07.2023 23:00 - 24:00 | 0 | 0 | 0 | 0 |
| 01.08.2023 00:00 - 01:00 | 0 | 0 | 0 | 0 |
| 01.08.2023 01:00 - 02:00 | 0 | 0 | 0 | 0 |
| 01.08.2023 02:00 - 03:00 | 0 | 0 | 0 | 0 |
| 01.08.2023 03:00 - 04:00 | 0 | 0 | 0 | 0 |
| 01.08.2023 04:00 - 05:00 | 0 | 0 | 0 | 0 |
| 01.08.2023 05:00 - 06:00 | 0 | 0 | 0 | 0 |